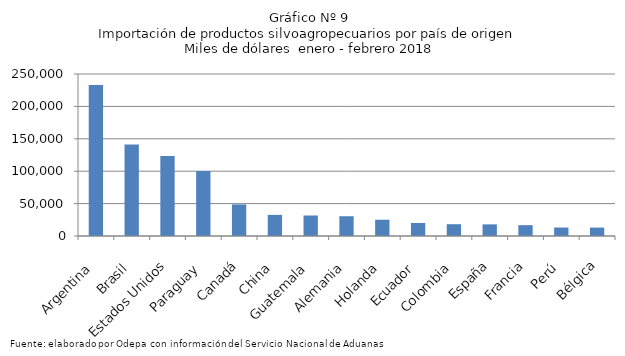
| Category | Series 0 |
|---|---|
| Argentina | 232988.44 |
| Brasil | 141123.835 |
| Estados Unidos | 123613.796 |
| Paraguay | 100203.695 |
| Canadá | 48714.432 |
| China | 32578.926 |
| Guatemala | 31640.787 |
| Alemania | 30502.589 |
| Holanda | 25075.155 |
| Ecuador | 20043.632 |
| Colombia | 18197.741 |
| España | 17943.817 |
| Francia | 16751.126 |
| Perú | 13083.976 |
| Bélgica | 12998.699 |